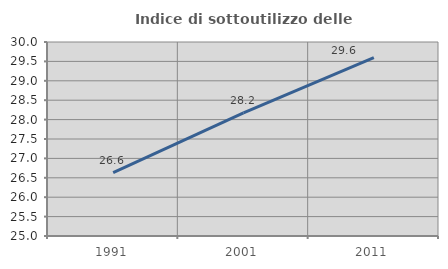
| Category | Indice di sottoutilizzo delle abitazioni  |
|---|---|
| 1991.0 | 26.631 |
| 2001.0 | 28.171 |
| 2011.0 | 29.598 |